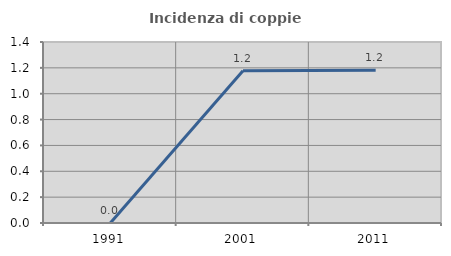
| Category | Incidenza di coppie miste |
|---|---|
| 1991.0 | 0 |
| 2001.0 | 1.178 |
| 2011.0 | 1.182 |